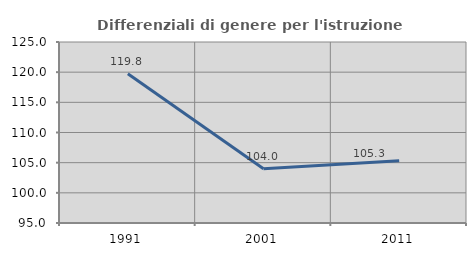
| Category | Differenziali di genere per l'istruzione superiore |
|---|---|
| 1991.0 | 119.753 |
| 2001.0 | 104.004 |
| 2011.0 | 105.314 |